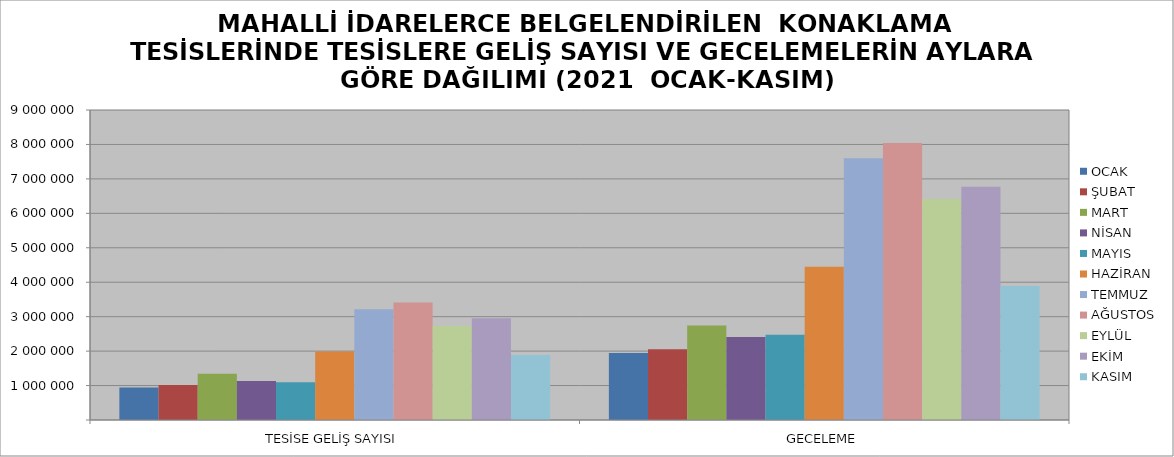
| Category | OCAK | ŞUBAT | MART | NİSAN | MAYIS | HAZİRAN | TEMMUZ | AĞUSTOS | EYLÜL | EKİM | KASIM |
|---|---|---|---|---|---|---|---|---|---|---|---|
| TESİSE GELİŞ SAYISI | 940331 | 1017199 | 1342202 | 1131069 | 1098456 | 1989433 | 3215014 | 3414690 | 2728285 | 2955029 | 1885159 |
| GECELEME | 1943007 | 2056594 | 2743257 | 2406723 | 2471826 | 4450821 | 7597288 | 8039529 | 6417353 | 6772005 | 3888626 |